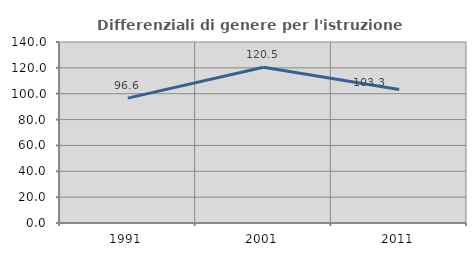
| Category | Differenziali di genere per l'istruzione superiore |
|---|---|
| 1991.0 | 96.569 |
| 2001.0 | 120.508 |
| 2011.0 | 103.324 |